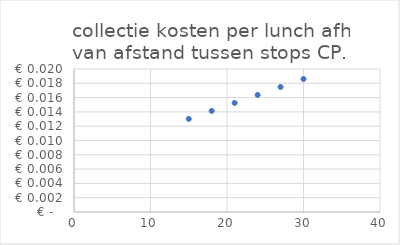
| Category |  € 0,013  |
|---|---|
| 15.0 | 0.013 |
| 18.0 | 0.014 |
| 21.0 | 0.015 |
| 24.0 | 0.016 |
| 27.0 | 0.017 |
| 30.0 | 0.019 |